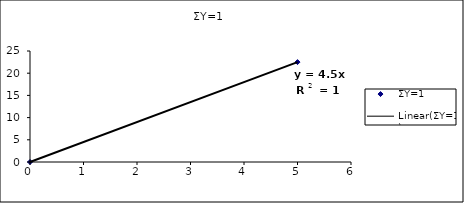
| Category | ΣΥ=1 |
|---|---|
| 0.0 | 0 |
| 5.0 | 22.5 |